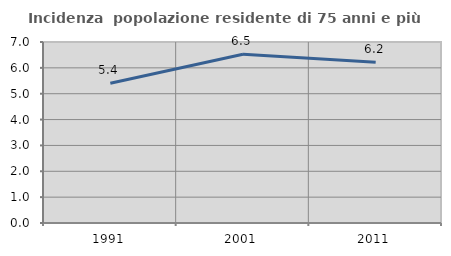
| Category | Incidenza  popolazione residente di 75 anni e più |
|---|---|
| 1991.0 | 5.405 |
| 2001.0 | 6.524 |
| 2011.0 | 6.216 |